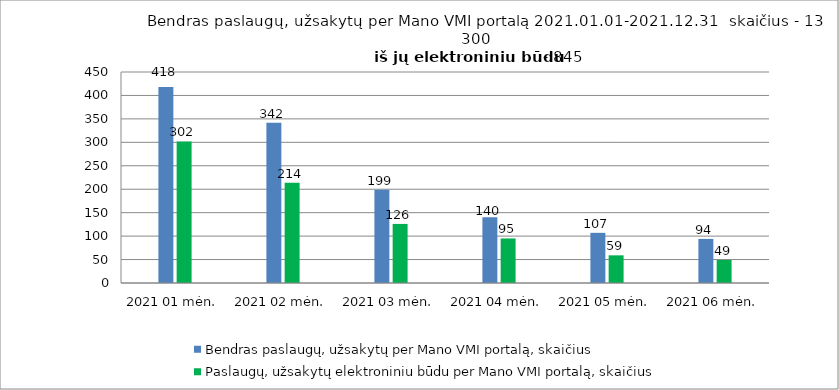
| Category | Bendras paslaugų, užsakytų per Mano VMI portalą, skaičius | Paslaugų, užsakytų elektroniniu būdu per Mano VMI portalą, skaičius |
|---|---|---|
| 2021 01 mėn. | 418 | 302 |
| 2021 02 mėn. | 342 | 214 |
| 2021 03 mėn. | 199 | 126 |
| 2021 04 mėn. | 140 | 95 |
| 2021 05 mėn. | 107 | 59 |
| 2021 06 mėn. | 94 | 49 |